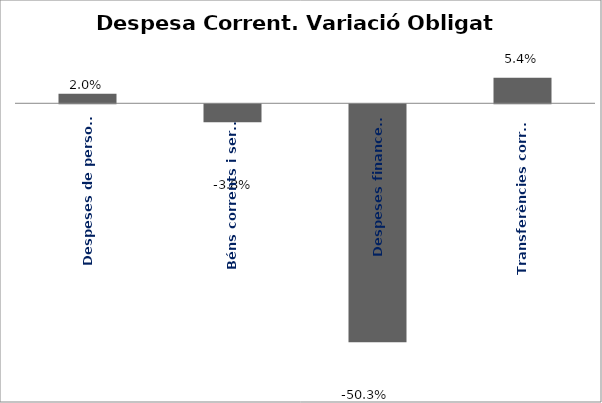
| Category | Series 0 |
|---|---|
| Despeses de personal | 0.02 |
| Béns corrents i serveis | -0.038 |
| Despeses financeres | -0.503 |
| Transferències corrents | 0.054 |